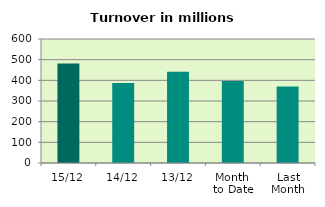
| Category | Series 0 |
|---|---|
| 15/12 | 481.439 |
| 14/12 | 387.052 |
| 13/12 | 441.637 |
| Month 
to Date | 397.113 |
| Last
Month | 369.747 |